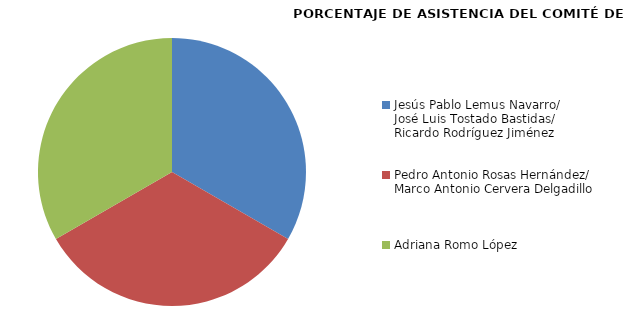
| Category | Series 0 |
|---|---|
| Jesús Pablo Lemus Navarro/ 
José Luis Tostado Bastidas/
Ricardo Rodríguez Jiménez | 100 |
| Pedro Antonio Rosas Hernández/
Marco Antonio Cervera Delgadillo | 100 |
| Adriana Romo López | 100 |